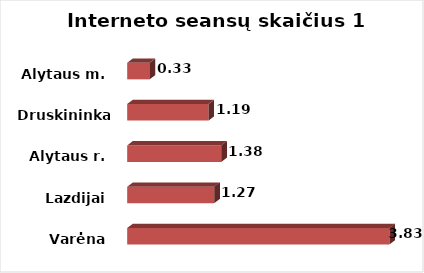
| Category | Series 0 |
|---|---|
| Varėna | 3.832 |
| Lazdijai | 1.272 |
| Alytaus r. | 1.375 |
| Druskininkai  | 1.188 |
| Alytaus m. | 0.328 |